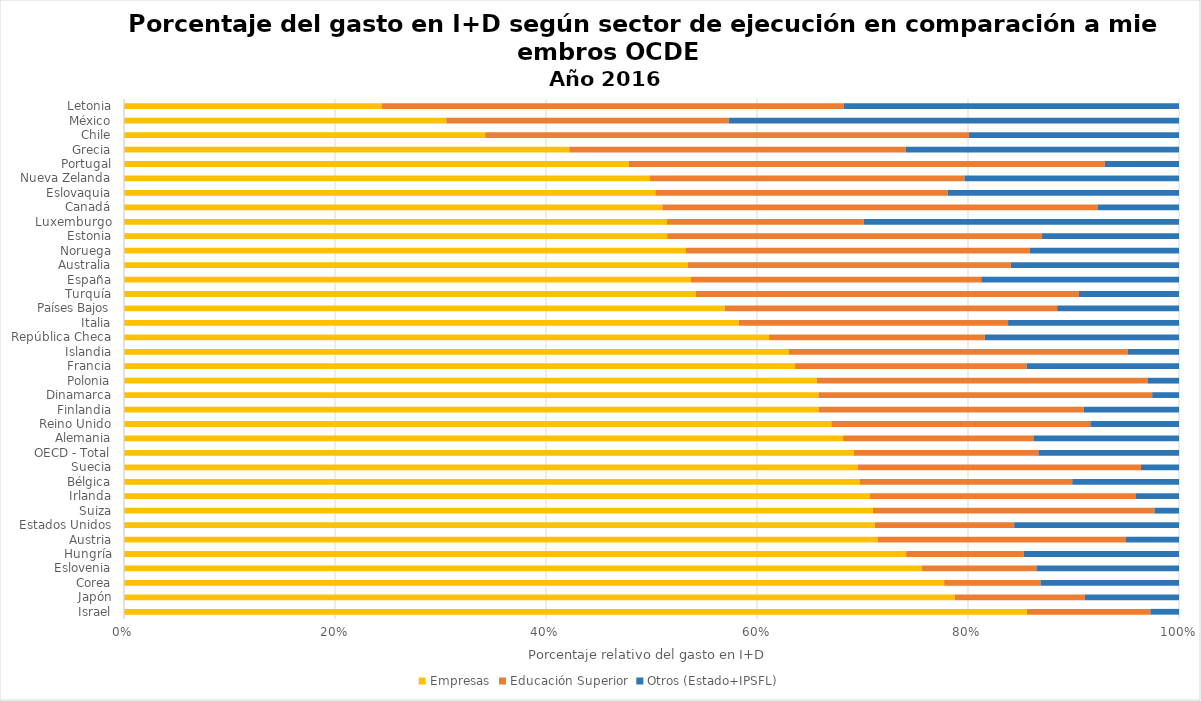
| Category | Empresas | Educación Superior | Otros (Estado+IPSFL) |
|---|---|---|---|
| Israel | 0.856 | 0.117 | 0.027 |
| Japón | 0.788 | 0.123 | 0.089 |
| Corea | 0.777 | 0.091 | 0.131 |
| Eslovenia | 0.756 | 0.109 | 0.135 |
| Hungría | 0.741 | 0.112 | 0.147 |
| Austria | 0.714 | 0.235 | 0.051 |
| Estados Unidos | 0.712 | 0.132 | 0.156 |
| Suiza | 0.71 | 0.267 | 0.023 |
| Irlanda | 0.707 | 0.252 | 0.041 |
| Bélgica | 0.697 | 0.202 | 0.101 |
| Suecia | 0.696 | 0.268 | 0.036 |
| OECD - Total | 0.692 | 0.175 | 0.133 |
| Alemania | 0.682 | 0.18 | 0.138 |
| Reino Unido | 0.67 | 0.246 | 0.084 |
| Finlandia | 0.658 | 0.251 | 0.09 |
| Dinamarca | 0.658 | 0.316 | 0.025 |
| Polonia | 0.657 | 0.314 | 0.03 |
| Francia | 0.636 | 0.22 | 0.144 |
| Islandia | 0.63 | 0.321 | 0.048 |
| República Checa | 0.611 | 0.204 | 0.184 |
| Italia | 0.583 | 0.255 | 0.162 |
| Países Bajos | 0.569 | 0.315 | 0.116 |
| Turquía | 0.542 | 0.363 | 0.095 |
| España | 0.537 | 0.275 | 0.187 |
| Australia | 0.534 | 0.306 | 0.159 |
| Noruega | 0.533 | 0.326 | 0.142 |
| Estonia | 0.515 | 0.355 | 0.13 |
| Luxemburgo | 0.515 | 0.186 | 0.299 |
| Canadá | 0.51 | 0.412 | 0.077 |
| Eslovaquia | 0.504 | 0.277 | 0.219 |
| Nueva Zelanda | 0.498 | 0.298 | 0.203 |
| Portugal | 0.478 | 0.451 | 0.07 |
| Grecia | 0.422 | 0.319 | 0.259 |
| Chile | 0.342 | 0.458 | 0.199 |
| México | 0.306 | 0.268 | 0.427 |
| Letonia | 0.245 | 0.438 | 0.318 |